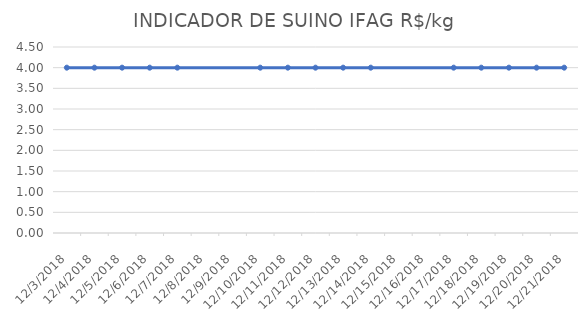
| Category | INDICADOR DE SUINO IFAG |
|---|---|
| 12/3/18 | 4 |
| 12/4/18 | 4 |
| 12/5/18 | 4 |
| 12/6/18 | 4 |
| 12/7/18 | 4 |
| 12/10/18 | 4 |
| 12/11/18 | 4 |
| 12/12/18 | 4 |
| 12/13/18 | 4 |
| 12/14/18 | 4 |
| 12/17/18 | 4 |
| 12/18/18 | 4 |
| 12/19/18 | 4 |
| 12/20/18 | 4 |
| 12/21/18 | 4 |